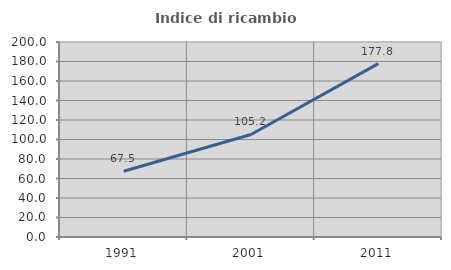
| Category | Indice di ricambio occupazionale  |
|---|---|
| 1991.0 | 67.464 |
| 2001.0 | 105.193 |
| 2011.0 | 177.778 |